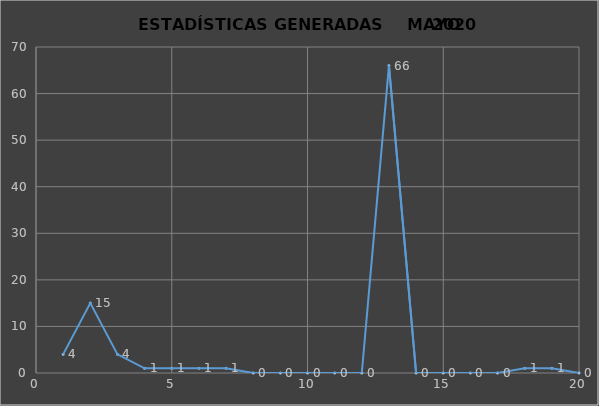
| Category |                   ESTADÍSTICAS GENERADAS     PERÍODO MAYO 2020 CANTIDAD |
|---|---|
| 0 | 4 |
| 1 | 15 |
| 2 | 4 |
| 3 | 1 |
| 4 | 1 |
| 5 | 1 |
| 6 | 1 |
| 7 | 0 |
| 8 | 0 |
| 9 | 0 |
| 10 | 0 |
| 11 | 0 |
| 12 | 66 |
| 13 | 0 |
| 14 | 0 |
| 15 | 0 |
| 16 | 0 |
| 17 | 1 |
| 18 | 1 |
| 19 | 0 |